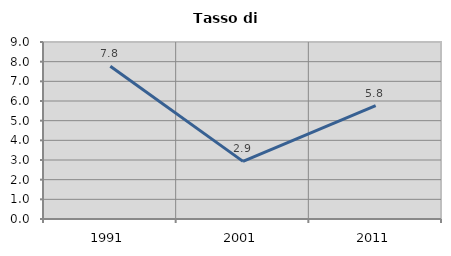
| Category | Tasso di disoccupazione   |
|---|---|
| 1991.0 | 7.765 |
| 2001.0 | 2.931 |
| 2011.0 | 5.767 |